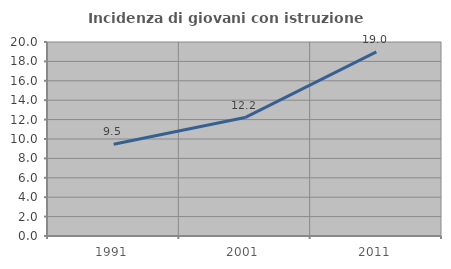
| Category | Incidenza di giovani con istruzione universitaria |
|---|---|
| 1991.0 | 9.468 |
| 2001.0 | 12.213 |
| 2011.0 | 18.973 |